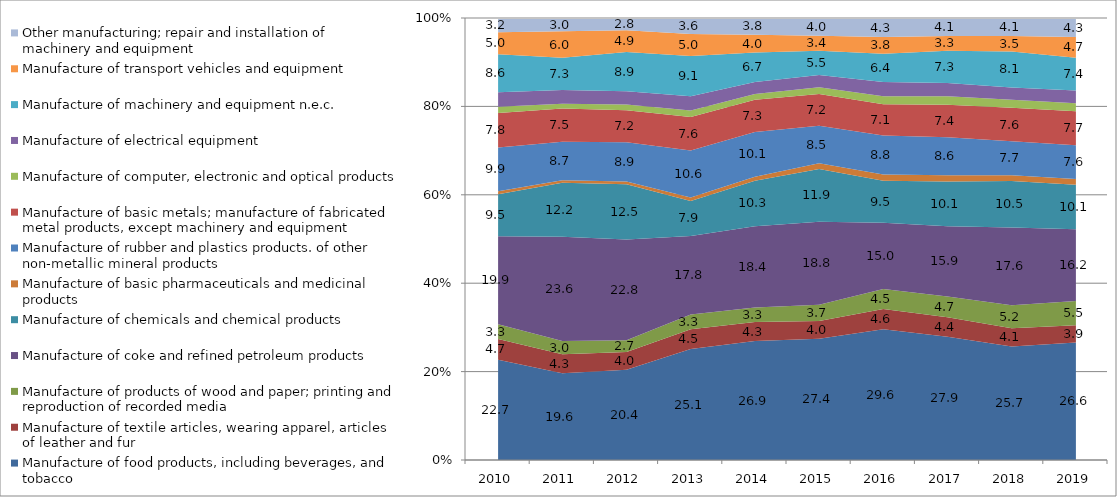
| Category | Manufacture of food products, including beverages, and tobacco | Manufacture of textile articles, wearing apparel, articles of leather and fur | Manufacture of products of wood and paper; printing and reproduction of recorded media | Manufacture of coke and refined petroleum products | Manufacture of chemicals and chemical products | Manufacture of basic pharmaceuticals and medicinal products | Manufacture of rubber and plastics products. of other non-metallic mineral products | Manufacture of basic metals; manufacture of fabricated metal products, except machinery and equipment | Manufacture of computer, electronic and optical products | Manufacture of electrical equipment | Manufacture of machinery and equipment n.e.c. | Manufacture of transport vehicles and equipment | Other manufacturing; repair and installation of machinery and equipment |
|---|---|---|---|---|---|---|---|---|---|---|---|---|---|
| 0 | 22.7 | 4.7 | 3.3 | 19.9 | 9.5 | 0.7 | 9.9 | 7.8 | 1.4 | 3.3 | 8.6 | 5 | 3.2 |
| 1 | 19.6 | 4.3 | 3 | 23.6 | 12.2 | 0.6 | 8.7 | 7.5 | 1.1 | 3.1 | 7.3 | 6 | 3 |
| 2 | 20.41 | 4 | 2.7 | 22.8 | 12.5 | 0.6 | 8.9 | 7.2 | 1.3 | 3 | 8.9 | 4.9 | 2.8 |
| 3 | 25.1 | 4.5 | 3.3 | 17.8 | 7.9 | 0.8 | 10.6 | 7.6 | 1.5 | 3.2 | 9.1 | 5 | 3.6 |
| 4 | 26.9 | 4.3 | 3.3 | 18.4 | 10.3 | 0.9 | 10.1 | 7.3 | 1.3 | 2.7 | 6.7 | 4 | 3.8 |
| 5 | 27.44 | 4 | 3.7 | 18.8 | 11.9 | 1.3 | 8.5 | 7.2 | 1.5 | 2.8 | 5.5 | 3.4 | 4 |
| 6 | 29.58 | 4.6 | 4.5 | 15 | 9.5 | 1.4 | 8.8 | 7.1 | 1.8 | 3.2 | 6.4 | 3.8 | 4.3 |
| 7 | 27.9 | 4.4 | 4.7 | 15.9 | 10.1 | 1.4 | 8.6 | 7.4 | 1.9 | 3 | 7.3 | 3.3 | 4.1 |
| 8 | 25.7 | 4.1 | 5.2 | 17.6 | 10.5 | 1.3 | 7.7 | 7.6 | 1.8 | 2.8 | 8.1 | 3.5 | 4.1 |
| 9 | 26.6 | 3.9 | 5.5 | 16.2 | 10.1 | 1.3 | 7.6 | 7.7 | 1.8 | 2.9 | 7.4 | 4.7 | 4.3 |